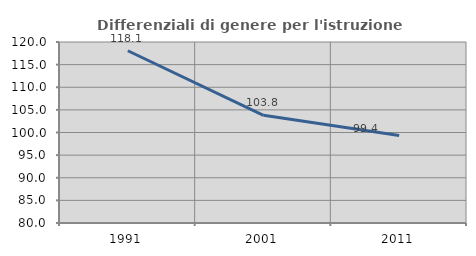
| Category | Differenziali di genere per l'istruzione superiore |
|---|---|
| 1991.0 | 118.065 |
| 2001.0 | 103.802 |
| 2011.0 | 99.355 |